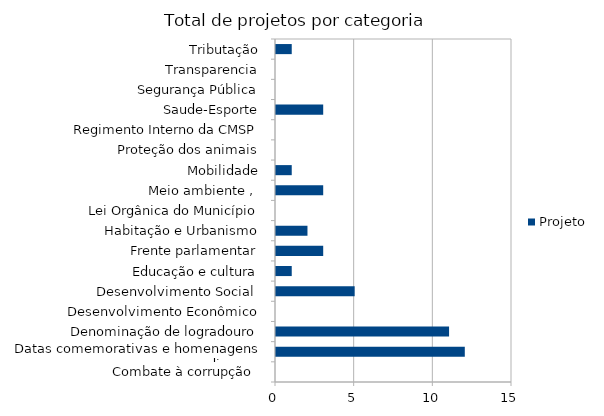
| Category | Projeto |
|---|---|
| Combate à corrupção  | 0 |
| Datas comemorativas e homenagens diversas | 12 |
| Denominação de logradouro | 11 |
| Desenvolvimento Econômico | 0 |
| Desenvolvimento Social  | 5 |
| Educação e cultura | 1 |
| Frente parlamentar | 3 |
| Habitação e Urbanismo | 2 |
| Lei Orgânica do Município | 0 |
| Meio ambiente ,  | 3 |
| Mobilidade | 1 |
| Proteção dos animais | 0 |
| Regimento Interno da CMSP | 0 |
| Saude-Esporte | 3 |
| Segurança Pública | 0 |
| Transparencia | 0 |
| Tributação | 1 |